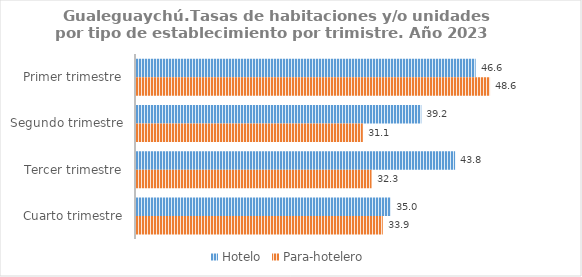
| Category | Hotelo | Para-hotelero |
|---|---|---|
| Primer trimestre | 46.634 | 48.611 |
| Segundo trimestre | 39.174 | 31.143 |
| Tercer trimestre | 43.812 | 32.34 |
| Cuarto trimestre | 34.997 | 33.883 |